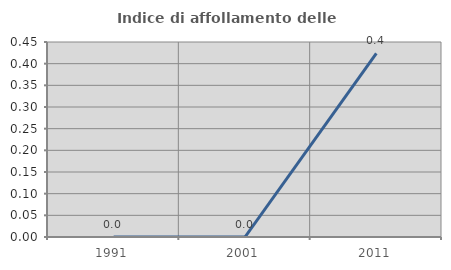
| Category | Indice di affollamento delle abitazioni  |
|---|---|
| 1991.0 | 0 |
| 2001.0 | 0 |
| 2011.0 | 0.424 |